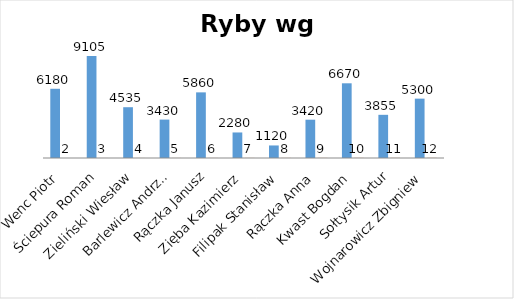
| Category | Series 0 | Series 1 |
|---|---|---|
| Wenc Piotr | 6180 | 2 |
| Ściepura Roman | 9105 | 3 |
| Zieliński Wiesław | 4535 | 4 |
| Barlewicz Andrzej | 3430 | 5 |
| Rączka Janusz | 5860 | 6 |
| Zięba Kazimierz | 2280 | 7 |
| Filipak Stanisław | 1120 | 8 |
| Rączka Anna | 3420 | 9 |
| Kwast Bogdan | 6670 | 10 |
| Sołtysik Artur | 3855 | 11 |
| Wojnarowicz Zbigniew | 5300 | 12 |